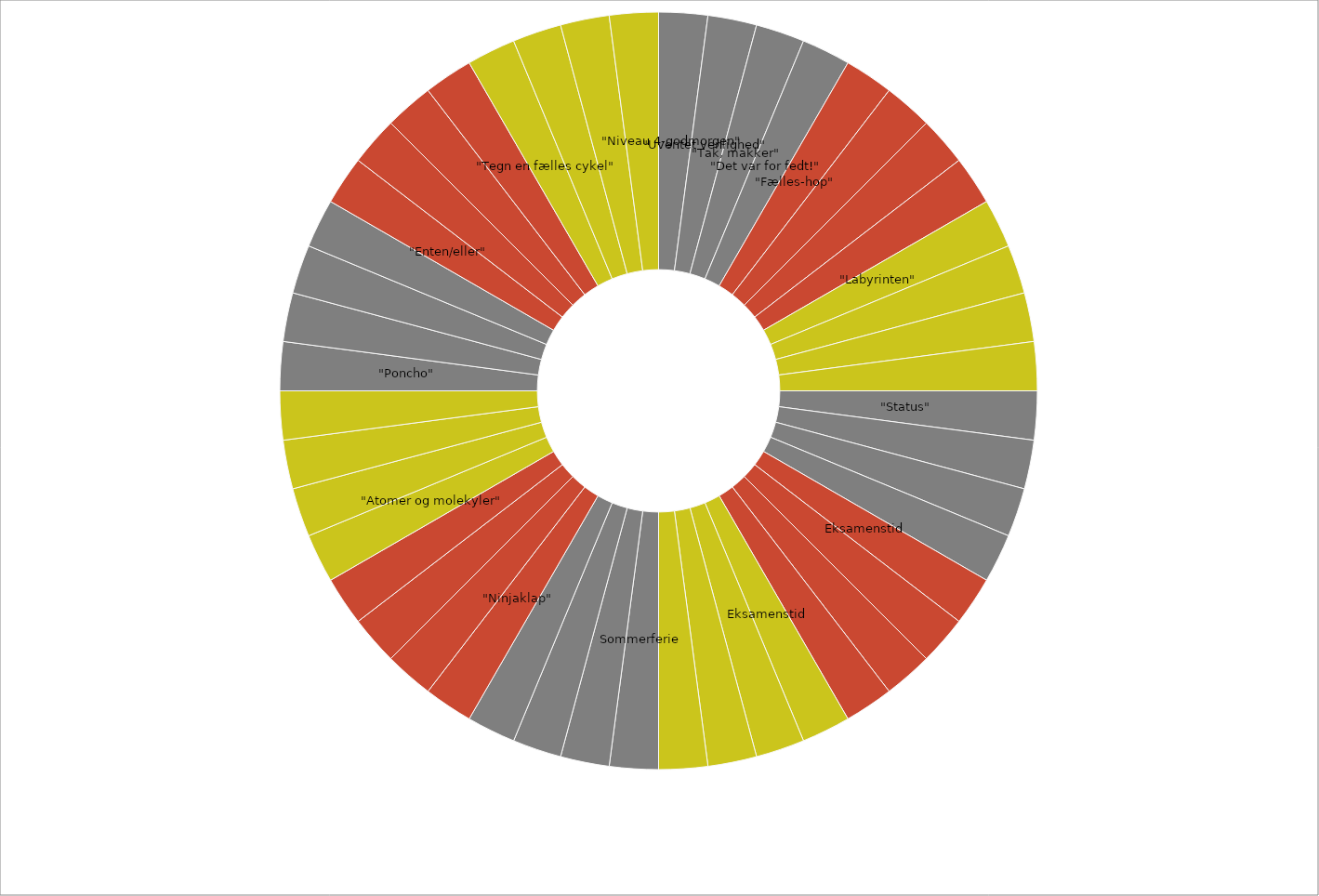
| Category | Series 0 |
|---|---|
| "Niveau 4-godmorgen" | 10 |
| "Uventet venlighed" | 10 |
| "Tak, makker" | 10 |
| "Det var for fedt!" | 10 |
| "Fælles-hop" | 10 |
|  | 10 |
|  | 10 |
|  | 10 |
| "Labyrinten"  | 10 |
|  | 10 |
|  | 10 |
|  | 10 |
| "Status" | 10 |
|  | 10 |
|  | 10 |
|  | 10 |
| Eksamenstid | 10 |
|  | 10 |
|  | 10 |
|  | 10 |
| Eksamenstid | 10 |
|  | 10 |
|  | 10 |
|  | 10 |
| Sommerferie | 10 |
|  | 10 |
|  | 10 |
|  | 10 |
| "Ninjaklap" | 10 |
|  | 10 |
|  | 10 |
|  | 10 |
| "Atomer og molekyler" | 10 |
|  | 10 |
|  | 10 |
|  | 10 |
| "Poncho" | 10 |
|  | 10 |
|  | 10 |
|  | 10 |
| "Enten/eller" | 10 |
|  | 10 |
|  | 10 |
|  | 10 |
| "Tegn en fælles cykel" | 10 |